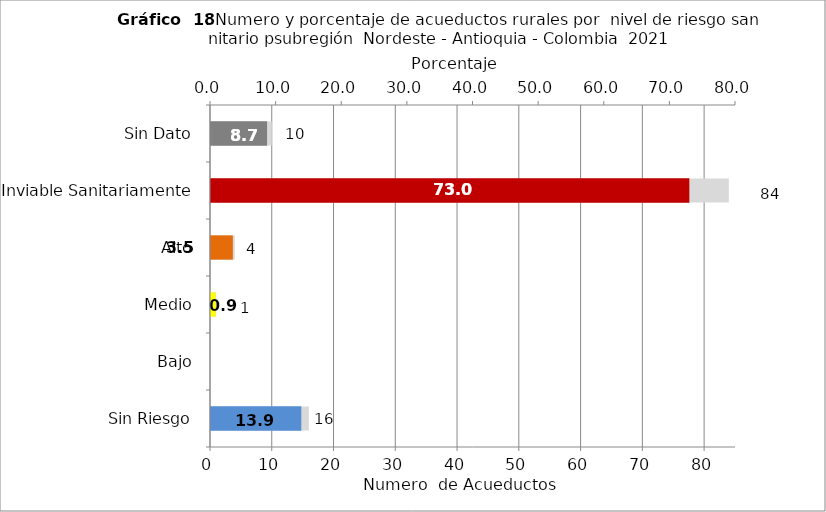
| Category | Número de Sistemas |
|---|---|
| Sin Riesgo | 16 |
| Bajo | 0 |
| Medio | 1 |
| Alto | 4 |
| Inviable Sanitariamente | 84 |
| Sin Dato | 10 |